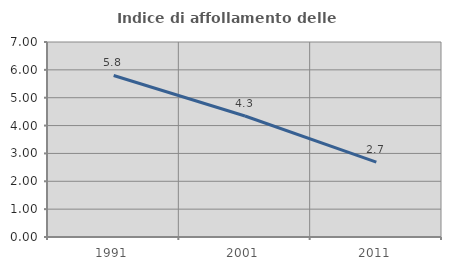
| Category | Indice di affollamento delle abitazioni  |
|---|---|
| 1991.0 | 5.799 |
| 2001.0 | 4.343 |
| 2011.0 | 2.687 |